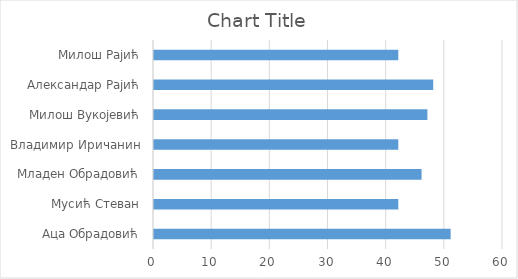
| Category | Series 0 |
|---|---|
| Аца Обрадовић | 51 |
| Мусић Стеван | 42 |
| Младен Обрадовић | 46 |
| Владимир Иричанин | 42 |
| Милош Вукојевић | 47 |
| Александар Рајић | 48 |
| Милош Рајић | 42 |